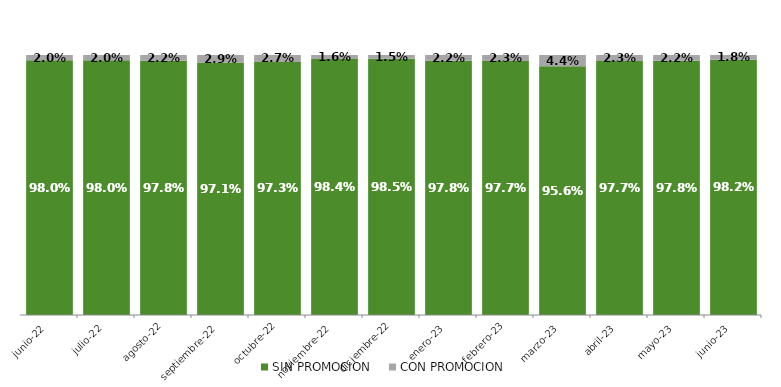
| Category | SIN PROMOCION   | CON PROMOCION   |
|---|---|---|
| 2022-06-01 | 0.98 | 0.02 |
| 2022-07-01 | 0.98 | 0.02 |
| 2022-08-01 | 0.978 | 0.022 |
| 2022-09-01 | 0.971 | 0.029 |
| 2022-10-01 | 0.973 | 0.027 |
| 2022-11-01 | 0.984 | 0.016 |
| 2022-12-01 | 0.985 | 0.015 |
| 2023-01-01 | 0.978 | 0.022 |
| 2023-02-01 | 0.977 | 0.023 |
| 2023-03-01 | 0.956 | 0.044 |
| 2023-04-01 | 0.977 | 0.023 |
| 2023-05-01 | 0.978 | 0.022 |
| 2023-06-01 | 0.982 | 0.018 |